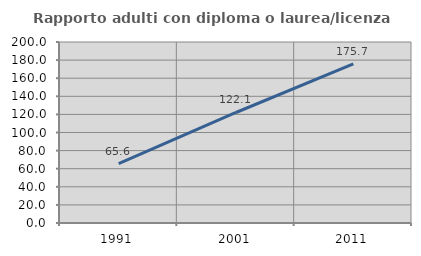
| Category | Rapporto adulti con diploma o laurea/licenza media  |
|---|---|
| 1991.0 | 65.604 |
| 2001.0 | 122.11 |
| 2011.0 | 175.704 |